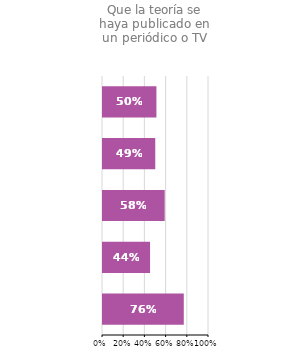
| Category | Que la teoría se haya publicado en un periódico o TV |
|---|---|
| Turquía | 0.762 |
| Israel | 0.444 |
| Estados Unidos | 0.582 |
| España | 0.493 |
| Total Europa | 0.504 |